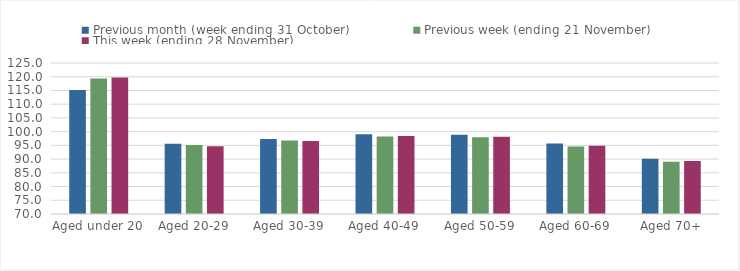
| Category | Previous month (week ending 31 October) | Previous week (ending 21 November) | This week (ending 28 November) |
|---|---|---|---|
| Aged under 20 | 115.16 | 119.36 | 119.75 |
| Aged 20-29 | 95.63 | 95.17 | 94.68 |
| Aged 30-39 | 97.34 | 96.76 | 96.57 |
| Aged 40-49 | 99.08 | 98.27 | 98.45 |
| Aged 50-59 | 98.84 | 97.94 | 98.18 |
| Aged 60-69 | 95.71 | 94.63 | 94.84 |
| Aged 70+ | 90.11 | 89.02 | 89.33 |